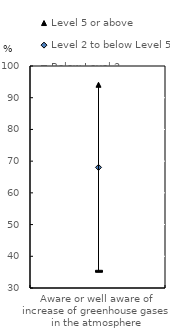
| Category | Level 5 or above | Level 2 to below Level 5 | Below Level 2 |
|---|---|---|---|
| Aware or well aware of increase of greenhouse gases in the atmosphere | 94.084 | 68.039 | 35.265 |